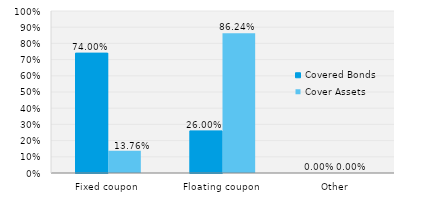
| Category | Covered Bonds | Cover Assets |
|---|---|---|
| Fixed coupon | 0.74 | 0.138 |
| Floating coupon | 0.26 | 0.862 |
| Other | 0 | 0 |